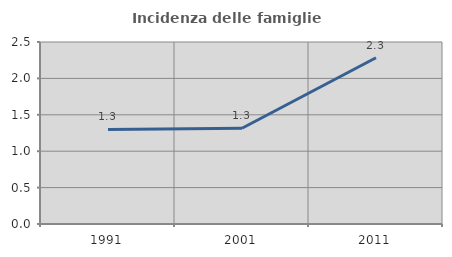
| Category | Incidenza delle famiglie numerose |
|---|---|
| 1991.0 | 1.299 |
| 2001.0 | 1.316 |
| 2011.0 | 2.283 |